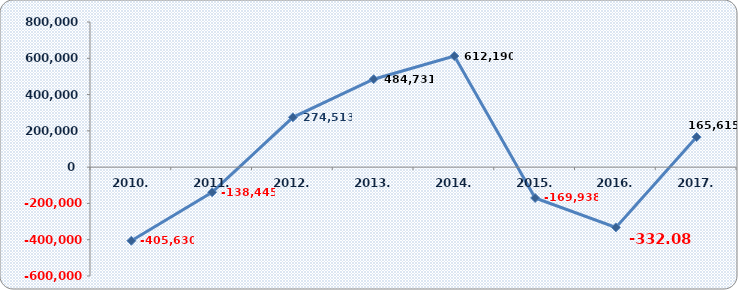
| Category | Dobit razdoblja (+) ili gubitak razdoblja (-)  |
|---|---|
| 2010. | -405630 |
| 2011. | -138445 |
| 2012. | 274513 |
| 2013. | 484731 |
| 2014. | 612190 |
| 2015. | -169937.776 |
| 2016. | -332084.15 |
| 2017. | 165614.757 |